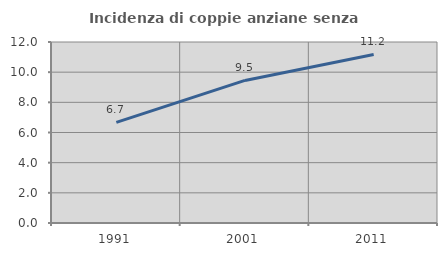
| Category | Incidenza di coppie anziane senza figli  |
|---|---|
| 1991.0 | 6.667 |
| 2001.0 | 9.451 |
| 2011.0 | 11.172 |